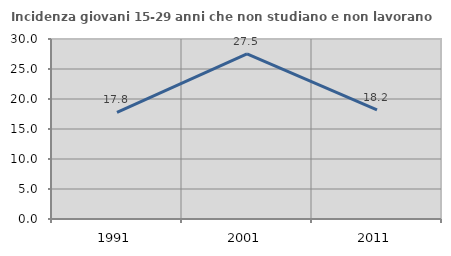
| Category | Incidenza giovani 15-29 anni che non studiano e non lavorano  |
|---|---|
| 1991.0 | 17.79 |
| 2001.0 | 27.536 |
| 2011.0 | 18.182 |